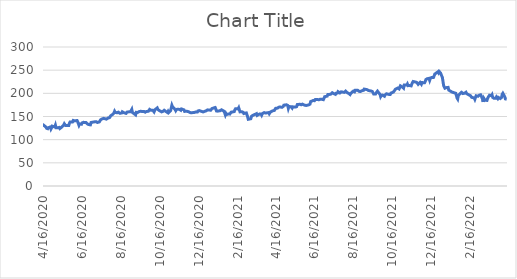
| Category | Series 0 |
|---|---|
| 4/16/20 | 127.45 |
| 4/17/20 | 130.72 |
| 4/20/20 | 127.39 |
| 4/21/20 | 124.7 |
| 4/22/20 | 125.81 |
| 4/23/20 | 123.64 |
| 4/24/20 | 125.91 |
| 4/27/20 | 127.42 |
| 4/28/20 | 123 |
| 4/29/20 | 125.55 |
| 4/30/20 | 129.31 |
| 5/1/20 | 127.53 |
| 5/4/20 | 127.44 |
| 5/5/20 | 131.3 |
| 5/6/20 | 125.69 |
| 5/7/20 | 124.24 |
| 5/8/20 | 125.47 |
| 5/11/20 | 126.39 |
| 5/12/20 | 124.01 |
| 5/13/20 | 123.03 |
| 5/14/20 | 126.03 |
| 5/15/20 | 127.49 |
| 5/18/20 | 131.42 |
| 5/19/20 | 134.34 |
| 5/20/20 | 133.34 |
| 5/21/20 | 130.33 |
| 5/22/20 | 130.11 |
| 5/26/20 | 130.45 |
| 5/27/20 | 135.64 |
| 5/28/20 | 138.11 |
| 5/29/20 | 139.39 |
| 6/1/20 | 138.34 |
| 6/2/20 | 141.48 |
| 6/3/20 | 142.53 |
| 6/4/20 | 140.52 |
| 6/5/20 | 141.01 |
| 6/8/20 | 141.3 |
| 6/9/20 | 138.8 |
| 6/10/20 | 139.91 |
| 6/11/20 | 131.06 |
| 6/12/20 | 134.07 |
| 6/15/20 | 133.3 |
| 6/16/20 | 136.24 |
| 6/17/20 | 136.79 |
| 6/18/20 | 137.4 |
| 6/19/20 | 137.4 |
| 6/22/20 | 136.94 |
| 6/23/20 | 138.11 |
| 6/24/20 | 134.3 |
| 6/25/20 | 135.31 |
| 6/26/20 | 132.66 |
| 6/29/20 | 131.98 |
| 6/30/20 | 137.04 |
| 7/1/20 | 137.19 |
| 7/2/20 | 137.66 |
| 7/6/20 | 138.6 |
| 7/7/20 | 138.44 |
| 7/8/20 | 138.81 |
| 7/9/20 | 137.68 |
| 7/10/20 | 137.1 |
| 7/13/20 | 138.31 |
| 7/14/20 | 140.4 |
| 7/15/20 | 142.92 |
| 7/16/20 | 142.94 |
| 7/17/20 | 144.66 |
| 7/20/20 | 145.97 |
| 7/21/20 | 145.01 |
| 7/22/20 | 145.11 |
| 7/23/20 | 144.07 |
| 7/24/20 | 144.22 |
| 7/27/20 | 146.92 |
| 7/28/20 | 145.98 |
| 7/29/20 | 147.59 |
| 7/30/20 | 149.11 |
| 7/31/20 | 151.68 |
| 8/3/20 | 154.51 |
| 8/4/20 | 155.64 |
| 8/5/20 | 157.72 |
| 8/6/20 | 161.33 |
| 8/7/20 | 158.88 |
| 8/10/20 | 158.09 |
| 8/11/20 | 156.93 |
| 8/12/20 | 159.36 |
| 8/13/20 | 158.87 |
| 8/14/20 | 157.05 |
| 8/17/20 | 157.42 |
| 8/18/20 | 160.17 |
| 8/19/20 | 158.58 |
| 8/20/20 | 158.54 |
| 8/21/20 | 158.37 |
| 8/24/20 | 156.76 |
| 8/25/20 | 158.58 |
| 8/26/20 | 159.76 |
| 8/27/20 | 159.61 |
| 8/28/20 | 160 |
| 8/31/20 | 160.1 |
| 9/1/20 | 162.05 |
| 9/2/20 | 165.33 |
| 9/3/20 | 158.8 |
| 9/4/20 | 157.24 |
| 9/8/20 | 153.51 |
| 9/9/20 | 158.91 |
| 9/10/20 | 158.1 |
| 9/11/20 | 158.59 |
| 9/14/20 | 160.86 |
| 9/15/20 | 162.28 |
| 9/16/20 | 161.25 |
| 9/17/20 | 160.47 |
| 9/18/20 | 160.87 |
| 9/21/20 | 160.97 |
| 9/22/20 | 161.51 |
| 9/23/20 | 159.33 |
| 9/24/20 | 157.98 |
| 9/25/20 | 160.84 |
| 9/28/20 | 161.32 |
| 9/29/20 | 162.48 |
| 9/30/20 | 165.37 |
| 10/1/20 | 164.03 |
| 10/2/20 | 163.55 |
| 10/5/20 | 163.45 |
| 10/6/20 | 161.52 |
| 10/7/20 | 159.91 |
| 10/8/20 | 163.17 |
| 10/9/20 | 165.43 |
| 10/12/20 | 168.55 |
| 10/13/20 | 165.32 |
| 10/14/20 | 163.66 |
| 10/15/20 | 162.99 |
| 10/16/20 | 163.55 |
| 10/19/20 | 159.99 |
| 10/20/20 | 159.69 |
| 10/21/20 | 161.18 |
| 10/22/20 | 162.38 |
| 10/23/20 | 163.49 |
| 10/26/20 | 160.48 |
| 10/27/20 | 162.47 |
| 10/28/20 | 158.69 |
| 10/29/20 | 161.19 |
| 10/30/20 | 158.55 |
| 11/2/20 | 162.89 |
| 11/3/20 | 163.14 |
| 11/4/20 | 174.35 |
| 11/5/20 | 170.9 |
| 11/6/20 | 169.25 |
| 11/9/20 | 165.2 |
| 11/10/20 | 162.56 |
| 11/11/20 | 164.95 |
| 11/12/20 | 165.19 |
| 11/13/20 | 165.78 |
| 11/16/20 | 165.29 |
| 11/17/20 | 165.43 |
| 11/18/20 | 163.5 |
| 11/19/20 | 166.31 |
| 11/20/20 | 166.2 |
| 11/23/20 | 164.34 |
| 11/24/20 | 161.06 |
| 11/25/20 | 160.19 |
| 11/27/20 | 161.47 |
| 11/30/20 | 160.38 |
| 12/1/20 | 161.36 |
| 12/2/20 | 158.95 |
| 12/3/20 | 157.07 |
| 12/4/20 | 157.95 |
| 12/7/20 | 158.45 |
| 12/8/20 | 158.99 |
| 12/9/20 | 158.7 |
| 12/10/20 | 158.12 |
| 12/11/20 | 159.53 |
| 12/14/20 | 159.5 |
| 12/15/20 | 161.96 |
| 12/16/20 | 160.62 |
| 12/17/20 | 162.7 |
| 12/18/20 | 163.63 |
| 12/21/20 | 160.84 |
| 12/22/20 | 161.83 |
| 12/23/20 | 159.85 |
| 12/24/20 | 160.72 |
| 12/28/20 | 162.39 |
| 12/29/20 | 163.12 |
| 12/30/20 | 164.27 |
| 12/31/20 | 165.5 |
| 1/4/21 | 163.59 |
| 1/5/21 | 164.73 |
| 1/6/21 | 167.15 |
| 1/7/21 | 167 |
| 1/8/21 | 168.11 |
| 1/11/21 | 169.39 |
| 1/12/21 | 166.12 |
| 1/13/21 | 161.95 |
| 1/14/21 | 160.96 |
| 1/15/21 | 161.56 |
| 1/19/21 | 162.57 |
| 1/20/21 | 163.36 |
| 1/21/21 | 164.46 |
| 1/22/21 | 163.33 |
| 1/25/21 | 161.34 |
| 1/26/21 | 159.71 |
| 1/27/21 | 153.15 |
| 1/28/21 | 156.53 |
| 1/29/21 | 154.25 |
| 2/1/21 | 155.58 |
| 2/2/21 | 157.39 |
| 2/3/21 | 155.23 |
| 2/4/21 | 157.13 |
| 2/5/21 | 159.28 |
| 2/8/21 | 160.02 |
| 2/9/21 | 159.83 |
| 2/10/21 | 160.62 |
| 2/11/21 | 164.44 |
| 2/12/21 | 166.71 |
| 2/16/21 | 166.32 |
| 2/17/21 | 168.9 |
| 2/18/21 | 167.95 |
| 2/19/21 | 160 |
| 2/22/21 | 160.16 |
| 2/23/21 | 159.52 |
| 2/24/21 | 159.05 |
| 2/25/21 | 156.48 |
| 2/26/21 | 155.24 |
| 3/1/21 | 157.69 |
| 3/2/21 | 157.05 |
| 3/3/21 | 149.32 |
| 3/4/21 | 144 |
| 3/5/21 | 145.68 |
| 3/8/21 | 145.15 |
| 3/9/21 | 150.14 |
| 3/10/21 | 151.09 |
| 3/11/21 | 152.36 |
| 3/12/21 | 152.57 |
| 3/15/21 | 154.84 |
| 3/16/21 | 155.03 |
| 3/17/21 | 156.17 |
| 3/18/21 | 152.42 |
| 3/19/21 | 153.12 |
| 3/22/21 | 155.63 |
| 3/23/21 | 156.04 |
| 3/24/21 | 155.43 |
| 3/25/21 | 152.88 |
| 3/26/21 | 156.15 |
| 3/29/21 | 158.39 |
| 3/30/21 | 157.04 |
| 3/31/21 | 157.48 |
| 4/1/21 | 157.89 |
| 4/5/21 | 158.41 |
| 4/6/21 | 155.9 |
| 4/7/21 | 157.88 |
| 4/8/21 | 160 |
| 4/9/21 | 159.85 |
| 4/12/21 | 162.51 |
| 4/13/21 | 163.47 |
| 4/14/21 | 163.08 |
| 4/15/21 | 165.45 |
| 4/16/21 | 167.63 |
| 4/19/21 | 168.1 |
| 4/20/21 | 168.74 |
| 4/21/21 | 170.15 |
| 4/22/21 | 169.07 |
| 4/23/21 | 170.54 |
| 4/26/21 | 169.8 |
| 4/27/21 | 169.75 |
| 4/28/21 | 171.72 |
| 4/29/21 | 174.52 |
| 4/30/21 | 173.03 |
| 5/3/21 | 175.24 |
| 5/4/21 | 173.77 |
| 5/5/21 | 173.86 |
| 5/6/21 | 167.52 |
| 5/7/21 | 171.55 |
| 5/10/21 | 171.17 |
| 5/11/21 | 170.23 |
| 5/12/21 | 168.04 |
| 5/13/21 | 170.85 |
| 5/14/21 | 172.29 |
| 5/17/21 | 170.27 |
| 5/18/21 | 170.11 |
| 5/19/21 | 171.28 |
| 5/20/21 | 175.8 |
| 5/21/21 | 176.02 |
| 5/24/21 | 176.4 |
| 5/25/21 | 176.62 |
| 5/26/21 | 175.32 |
| 5/27/21 | 174.67 |
| 5/28/21 | 176.68 |
| 6/1/21 | 174.19 |
| 6/2/21 | 172.95 |
| 6/3/21 | 173.82 |
| 6/4/21 | 175.2 |
| 6/7/21 | 175.1 |
| 6/8/21 | 174.1 |
| 6/9/21 | 176.69 |
| 6/10/21 | 182.1 |
| 6/11/21 | 182.2 |
| 6/14/21 | 184.58 |
| 6/15/21 | 185.67 |
| 6/16/21 | 184.11 |
| 6/17/21 | 186.44 |
| 6/18/21 | 185.39 |
| 6/21/21 | 186.6 |
| 6/22/21 | 186.62 |
| 6/23/21 | 186.12 |
| 6/24/21 | 185.38 |
| 6/25/21 | 187.23 |
| 6/28/21 | 187.08 |
| 6/29/21 | 187.99 |
| 6/30/21 | 186.36 |
| 7/1/21 | 189.29 |
| 7/2/21 | 192.7 |
| 7/6/21 | 194.02 |
| 7/7/21 | 197.4 |
| 7/8/21 | 196.96 |
| 7/9/21 | 197.5 |
| 7/12/21 | 198.33 |
| 7/13/21 | 199.31 |
| 7/14/21 | 201.28 |
| 7/15/21 | 200.24 |
| 7/16/21 | 199.68 |
| 7/19/21 | 197.83 |
| 7/20/21 | 200.11 |
| 7/21/21 | 198.04 |
| 7/22/21 | 200.54 |
| 7/23/21 | 203.59 |
| 7/26/21 | 200.82 |
| 7/27/21 | 201.87 |
| 7/28/21 | 203.27 |
| 7/29/21 | 204.12 |
| 7/30/21 | 202.7 |
| 8/2/21 | 202.11 |
| 8/3/21 | 204.1 |
| 8/4/21 | 204.79 |
| 8/5/21 | 203.84 |
| 8/6/21 | 201.88 |
| 8/9/21 | 199.72 |
| 8/10/21 | 198.76 |
| 8/11/21 | 197.41 |
| 8/12/21 | 199.84 |
| 8/13/21 | 201.48 |
| 8/16/21 | 204.78 |
| 8/17/21 | 206.6 |
| 8/18/21 | 203.33 |
| 8/19/21 | 206.44 |
| 8/20/21 | 207.05 |
| 8/23/21 | 206.47 |
| 8/24/21 | 204.99 |
| 8/25/21 | 204.43 |
| 8/26/21 | 204.02 |
| 8/27/21 | 203.82 |
| 8/30/21 | 205.89 |
| 8/31/21 | 204.56 |
| 9/1/21 | 206.44 |
| 9/2/21 | 209.22 |
| 9/3/21 | 209.69 |
| 9/7/21 | 207.81 |
| 9/8/21 | 209.33 |
| 9/9/21 | 206.02 |
| 9/10/21 | 207 |
| 9/13/21 | 205 |
| 9/14/21 | 203.55 |
| 9/15/21 | 203.96 |
| 9/16/21 | 202.77 |
| 9/17/21 | 198.49 |
| 9/20/21 | 198.62 |
| 9/21/21 | 201.01 |
| 9/22/21 | 201.35 |
| 9/23/21 | 204.71 |
| 9/24/21 | 204.73 |
| 9/27/21 | 197.8 |
| 9/28/21 | 192.77 |
| 9/29/21 | 194.99 |
| 9/30/21 | 194.14 |
| 10/1/21 | 196.19 |
| 10/4/21 | 193.69 |
| 10/5/21 | 196.46 |
| 10/6/21 | 195.78 |
| 10/7/21 | 199.01 |
| 10/8/21 | 197.88 |
| 10/11/21 | 197.65 |
| 10/12/21 | 197.15 |
| 10/13/21 | 197.46 |
| 10/14/21 | 200.39 |
| 10/15/21 | 202.22 |
| 10/18/21 | 202.73 |
| 10/19/21 | 204.44 |
| 10/20/21 | 206.31 |
| 10/21/21 | 208.62 |
| 10/22/21 | 208.51 |
| 10/25/21 | 211.52 |
| 10/26/21 | 210.52 |
| 10/27/21 | 209.58 |
| 10/28/21 | 212.67 |
| 10/29/21 | 216.2 |
| 11/1/21 | 213.6 |
| 11/2/21 | 212.2 |
| 11/3/21 | 211.13 |
| 11/4/21 | 217.77 |
| 11/5/21 | 216.73 |
| 11/8/21 | 217.8 |
| 11/9/21 | 220.22 |
| 11/10/21 | 216.58 |
| 11/11/21 | 215.69 |
| 11/12/21 | 216.85 |
| 11/15/21 | 216.06 |
| 11/16/21 | 220.18 |
| 11/17/21 | 221.87 |
| 11/18/21 | 225.54 |
| 11/19/21 | 226.43 |
| 11/22/21 | 224.34 |
| 11/23/21 | 223.66 |
| 11/24/21 | 223.17 |
| 11/26/21 | 219.32 |
| 11/29/21 | 223.55 |
| 11/30/21 | 222.04 |
| 12/1/21 | 219.66 |
| 12/2/21 | 223.19 |
| 12/3/21 | 223.33 |
| 12/6/21 | 222.97 |
| 12/7/21 | 225.7 |
| 12/8/21 | 229.62 |
| 12/9/21 | 230.16 |
| 12/10/21 | 231.45 |
| 12/13/21 | 232.36 |
| 12/14/21 | 228.07 |
| 12/15/21 | 232.08 |
| 12/16/21 | 232.81 |
| 12/17/21 | 234.31 |
| 12/20/21 | 234.26 |
| 12/21/21 | 237.64 |
| 12/22/21 | 241.57 |
| 12/23/21 | 242.51 |
| 12/27/21 | 246.51 |
| 12/28/21 | 244.25 |
| 12/29/21 | 247.03 |
| 12/30/21 | 245.16 |
| 12/31/21 | 244.03 |
| 1/3/22 | 234.03 |
| 1/4/22 | 225.12 |
| 1/5/22 | 216.56 |
| 1/6/22 | 217.42 |
| 1/7/22 | 211.09 |
| 1/10/22 | 212.6 |
| 1/11/22 | 212.8 |
| 1/12/22 | 212.81 |
| 1/13/22 | 207 |
| 1/14/22 | 206.18 |
| 1/18/22 | 202.7 |
| 1/19/22 | 200.58 |
| 1/20/22 | 201.96 |
| 1/21/22 | 200.33 |
| 1/24/22 | 200.07 |
| 1/25/22 | 195.25 |
| 1/26/22 | 189.84 |
| 1/27/22 | 187.66 |
| 1/28/22 | 195.3 |
| 1/31/22 | 199.79 |
| 2/1/22 | 198.87 |
| 2/2/22 | 202.17 |
| 2/3/22 | 200.92 |
| 2/4/22 | 199.54 |
| 2/7/22 | 200.32 |
| 2/8/22 | 201.3 |
| 2/9/22 | 202.29 |
| 2/10/22 | 199.37 |
| 2/11/22 | 198.87 |
| 2/14/22 | 196.43 |
| 2/15/22 | 197.76 |
| 2/16/22 | 195.09 |
| 2/17/22 | 193.07 |
| 2/18/22 | 191.32 |
| 2/22/22 | 190.1 |
| 2/23/22 | 187.06 |
| 2/24/22 | 190.95 |
| 2/25/22 | 194.71 |
| 2/28/22 | 193.65 |
| 3/1/22 | 192.54 |
| 3/2/22 | 196.07 |
| 3/3/22 | 195.87 |
| 3/4/22 | 196.84 |
| 3/7/22 | 188.09 |
| 3/8/22 | 181.39 |
| 3/9/22 | 189.58 |
| 3/10/22 | 189.22 |
| 3/11/22 | 185.29 |
| 3/14/22 | 184.66 |
| 3/15/22 | 189.11 |
| 3/16/22 | 191.92 |
| 3/17/22 | 193.68 |
| 3/18/22 | 195.9 |
| 3/21/22 | 194.71 |
| 3/22/22 | 196.88 |
| 3/23/22 | 191.23 |
| 3/24/22 | 189.57 |
| 3/25/22 | 189.43 |
| 3/28/22 | 189.37 |
| 3/29/22 | 192.28 |
| 3/30/22 | 191.32 |
| 3/31/22 | 188.59 |
| 4/1/22 | 191.11 |
| 4/4/22 | 188.74 |
| 4/5/22 | 188.4 |
| 4/6/22 | 191.38 |
| 4/7/22 | 197.93 |
| 4/8/22 | 200.09 |
| 4/11/22 | 192.5 |
| 4/12/22 | 187.91 |
| 4/13/22 | 189.52 |
| 4/14/22 | 187.3 |